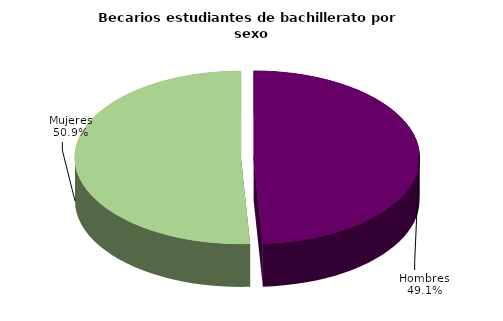
| Category | Series 0 |
|---|---|
| Hombres | 51182 |
| Mujeres | 53028 |